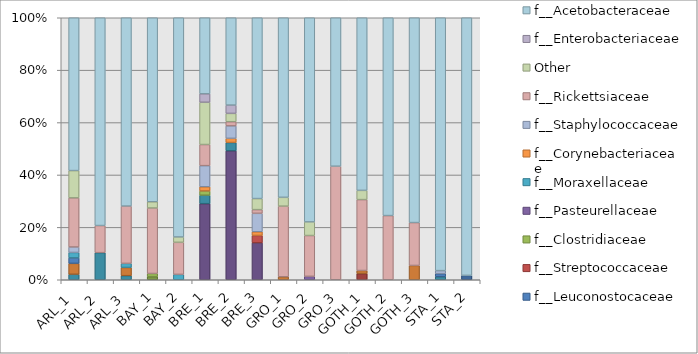
| Category | f__Micrococcaceae | f__Propionibacteriaceae | f__Bacteroidaceae | f__Planococcaceae | f__Enterococcaceae | f__Lactobacillaceae | f__Leuconostocaceae | f__Streptococcaceae | f__Clostridiaceae | f__Pasteurellaceae | f__Moraxellaceae | f__Corynebacteriaceae | f__Staphylococcaceae | f__Rickettsiaceae | Other | f__Enterobacteriaceae | f__Acetobacteraceae |
|---|---|---|---|---|---|---|---|---|---|---|---|---|---|---|---|---|---|
| ARL_1 | 0 | 0 | 0 | 0 | 0.02 | 0.04 | 0.02 | 0 | 0 | 0 | 0.02 | 0 | 0.02 | 0.18 | 0.1 | 0 | 0.56 |
| ARL_2 | 0 | 0 | 0 | 0 | 0.1 | 0 | 0 | 0 | 0 | 0 | 0 | 0 | 0 | 0.1 | 0 | 0 | 0.767 |
| ARL_3 | 0 | 0 | 0 | 0 | 0.015 | 0.031 | 0 | 0 | 0 | 0 | 0.015 | 0 | 0 | 0.215 | 0 | 0 | 0.708 |
| BAY_1 | 0 | 0 | 0.012 | 0 | 0 | 0 | 0 | 0 | 0.012 | 0 | 0 | 0 | 0 | 0.25 | 0.024 | 0 | 0.702 |
| BAY_2 | 0 | 0 | 0 | 0 | 0 | 0 | 0 | 0 | 0 | 0 | 0.02 | 0 | 0 | 0.118 | 0.02 | 0 | 0.804 |
| BRE_1 | 0 | 0 | 0 | 0.277 | 0.031 | 0 | 0 | 0 | 0.015 | 0 | 0 | 0.015 | 0.077 | 0.077 | 0.154 | 0.031 | 0.277 |
| BRE_2 | 0 | 0 | 0 | 0.477 | 0.031 | 0 | 0 | 0 | 0 | 0 | 0 | 0.015 | 0.046 | 0.015 | 0.031 | 0.031 | 0.323 |
| BRE_3 | 0 | 0 | 0 | 0.135 | 0 | 0 | 0 | 0.027 | 0 | 0 | 0 | 0.014 | 0.068 | 0.014 | 0.041 | 0 | 0.662 |
| GRO_1 | 0 | 0 | 0 | 0 | 0 | 0.011 | 0 | 0 | 0 | 0 | 0 | 0 | 0 | 0.264 | 0.033 | 0 | 0.67 |
| GRO_2 | 0 | 0 | 0 | 0 | 0 | 0 | 0 | 0 | 0 | 0.013 | 0 | 0 | 0 | 0.156 | 0.052 | 0 | 0.779 |
| GRO_3 | 0 | 0 | 0 | 0 | 0 | 0 | 0 | 0 | 0 | 0 | 0 | 0 | 0 | 0.419 | 0 | 0 | 0.548 |
| GOTH_1 | 0 | 0.024 | 0 | 0 | 0 | 0.012 | 0 | 0 | 0 | 0 | 0 | 0 | 0 | 0.271 | 0.035 | 0 | 0.659 |
| GOTH_2 | 0 | 0 | 0 | 0 | 0 | 0 | 0 | 0 | 0 | 0 | 0 | 0 | 0 | 0.24 | 0 | 0 | 0.74 |
| GOTH_3 | 0 | 0 | 0 | 0 | 0 | 0.055 | 0 | 0 | 0 | 0 | 0 | 0 | 0 | 0.164 | 0 | 0 | 0.782 |
| STA_1 | 0 | 0 | 0 | 0 | 0.011 | 0 | 0.011 | 0 | 0 | 0 | 0 | 0 | 0.011 | 0 | 0 | 0 | 0.954 |
| STA_2 | 0.016 | 0 | 0 | 0 | 0 | 0 | 0 | 0 | 0 | 0 | 0 | 0 | 0 | 0 | 0 | 0 | 0.967 |